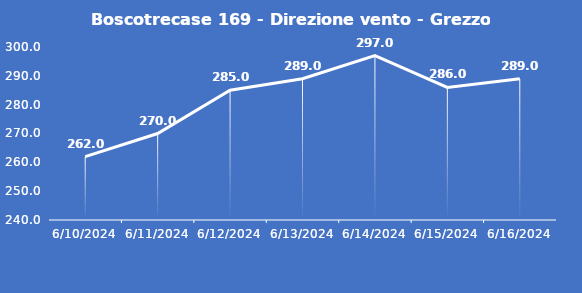
| Category | Boscotrecase 169 - Direzione vento - Grezzo (°N) |
|---|---|
| 6/10/24 | 262 |
| 6/11/24 | 270 |
| 6/12/24 | 285 |
| 6/13/24 | 289 |
| 6/14/24 | 297 |
| 6/15/24 | 286 |
| 6/16/24 | 289 |